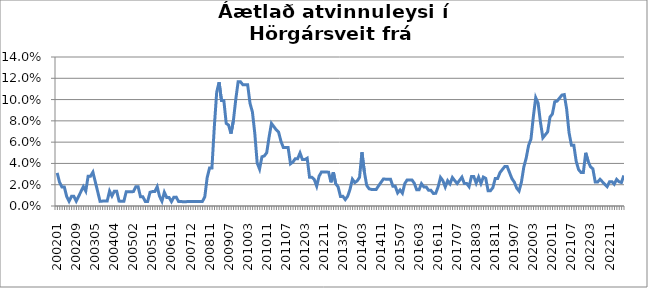
| Category | Series 0 |
|---|---|
| 200201 | 0.031 |
| 200202 | 0.022 |
| 200203 | 0.018 |
| 200204 | 0.018 |
| 200205 | 0.009 |
| 200206 | 0.004 |
| 200207 | 0.009 |
| 200208 | 0.009 |
| 200209 | 0.005 |
| 200210 | 0.009 |
| 200211 | 0.014 |
| 200212 | 0.018 |
| 200301 | 0.014 |
| 200302 | 0.028 |
| 200303 | 0.028 |
| 200304 | 0.032 |
| 200305 | 0.023 |
| 200306 | 0.014 |
| 200307 | 0.004 |
| 200311 | 0.005 |
| 200312 | 0.005 |
| 200401 | 0.005 |
| 200402 | 0.014 |
| 200403 | 0.009 |
| 200404 | 0.014 |
| 200405 | 0.014 |
| 200406 | 0.005 |
| 200409 | 0.004 |
| 200410 | 0.004 |
| 200411 | 0.013 |
| 200412 | 0.013 |
| 200501 | 0.013 |
| 200502 | 0.014 |
| 200503 | 0.018 |
| 200504 | 0.018 |
| 200505 | 0.009 |
| 200506 | 0.009 |
| 200507 | 0.004 |
| 200508 | 0.004 |
| 200510 | 0.013 |
| 200511 | 0.014 |
| 200512 | 0.014 |
| 200601 | 0.018 |
| 200602 | 0.009 |
| 200603 | 0.005 |
| 200606 | 0.013 |
| 200607 | 0.008 |
| 200608 | 0.008 |
| 200611 | 0.004 |
| 200612 | 0.008 |
| 200701 | 0.008 |
| 200702 | 0.004 |
| 200703 | 0.004 |
| 200704 | 0.004 |
| 200706 | 0.004 |
| 200711 | 0.004 |
| 200712 | 0.004 |
| 200801 | 0.004 |
| 200802 | 0.004 |
| 200803 | 0.004 |
| 200807 | 0.004 |
| 200808 | 0.004 |
| 200809 | 0.009 |
| 200810 | 0.027 |
| 200811 | 0.036 |
| 200812 | 0.036 |
| 200901 | 0.074 |
| 200902 | 0.107 |
| 200903 | 0.116 |
| 200904 | 0.099 |
| 200905 | 0.099 |
| 200906 | 0.078 |
| 200907 | 0.076 |
| 200908 | 0.068 |
| 200909 | 0.08 |
| 200910 | 0.1 |
| 200911 | 0.117 |
| 200912 | 0.117 |
| 201001 | 0.114 |
| 201002 | 0.114 |
| 201003 | 0.114 |
| 201004 | 0.096 |
| 201005 | 0.088 |
| 201006 | 0.068 |
| 201007 | 0.04 |
| 201008 | 0.035 |
| 201009 | 0.046 |
| 201010 | 0.047 |
| 201011 | 0.05 |
| 201012 | 0.065 |
| 201101 | 0.078 |
| 201102 | 0.075 |
| 201103 | 0.072 |
| 201104 | 0.069 |
| 201105 | 0.061 |
| 201106 | 0.055 |
| 201107 | 0.055 |
| 201108 | 0.055 |
| 201109 | 0.04 |
| 201110 | 0.041 |
| 201111 | 0.044 |
| 201112 | 0.044 |
| 201201 | 0.05 |
| 201202 | 0.044 |
| 201203 | 0.044 |
| 201204 | 0.045 |
| 201205 | 0.027 |
| 201206 | 0.027 |
| 201207 | 0.025 |
| 201208 | 0.019 |
| 201209 | 0.028 |
| 201210 | 0.032 |
| 201211 | 0.032 |
| 201212 | 0.032 |
| 201301 | 0.032 |
| 201302 | 0.022 |
| 201303 | 0.032 |
| 201304 | 0.021 |
| 201305 | 0.018 |
| 201306 | 0.009 |
| 201307 | 0.009 |
| 201308 | 0.006 |
| 201309 | 0.009 |
| 201310 | 0.016 |
| 201311 | 0.025 |
| 201312 | 0.022 |
| 201401 | 0.024 |
| 201402 | 0.027 |
| 201403 | 0.051 |
| 201404 | 0.032 |
| 201405 | 0.019 |
| 201406 | 0.016 |
| 201407 | 0.016 |
| 201408 | 0.016 |
| 201409 | 0.016 |
| 201410 | 0.019 |
| 201411 | 0.022 |
| 201412 | 0.025 |
| 201501 | 0.025 |
| 201502 | 0.025 |
| 201503 | 0.025 |
| 201504 | 0.018 |
| 201505 | 0.018 |
| 201506 | 0.012 |
| 201507 | 0.015 |
| 201508 | 0.012 |
| 201509 | 0.021 |
| 201510 | 0.025 |
| 201511 | 0.025 |
| 201512 | 0.025 |
| 201601 | 0.021 |
| 201602 | 0.015 |
| 201603 | 0.015 |
| 201604 | 0.021 |
| 201605 | 0.018 |
| 201606 | 0.018 |
| 201607 | 0.015 |
| 201608 | 0.015 |
| 201609 | 0.012 |
| 201610 | 0.012 |
| 201611 | 0.018 |
| 201612 | 0.027 |
| 201701 | 0.024 |
| 201702 | 0.018 |
| 201703 | 0.024 |
| 201704 | 0.021 |
| 201705 | 0.027 |
| 201706 | 0.024 |
| 201707 | 0.021 |
| 201708 | 0.024 |
| 201709 | 0.027 |
| 201710 | 0.021 |
| 201711 | 0.021 |
| 201712 | 0.018 |
| 201801 | 0.028 |
| 201802 | 0.028 |
| 201803 | 0.021 |
| 201804 | 0.027 |
| 201805 | 0.021 |
| 201806 | 0.027 |
| 201807 | 0.026 |
| 201808 | 0.014 |
| 201809 | 0.014 |
| 201810 | 0.017 |
| 201811 | 0.026 |
| 201812 | 0.026 |
| 201901 | 0.031 |
| 201902 | 0.034 |
| 201903 | 0.037 |
| 201904 | 0.037 |
| 201905 | 0.031 |
| 201906 | 0.026 |
| 201907 | 0.022 |
| 201908 | 0.017 |
| 201909 | 0.014 |
| 201910 | 0.023 |
| 201911 | 0.037 |
| 201912 | 0.045 |
| 202001 | 0.057 |
| 202002 | 0.063 |
| 202003 | 0.084 |
| 202004 | 0.102 |
| 202005 | 0.097 |
| 202006 | 0.079 |
| 202007 | 0.064 |
| 202008 | 0.067 |
| 202009 | 0.07 |
| 202010 | 0.084 |
| 202011 | 0.086 |
| 202012 | 0.098 |
| 202101 | 0.099 |
| 202102 | 0.101 |
| 202103 | 0.104 |
| 202104 | 0.105 |
| 202105 | 0.091 |
| 202106 | 0.069 |
| 202107 | 0.057 |
| 202108 | 0.057 |
| 202109 | 0.042 |
| 202110 | 0.034 |
| 202111 | 0.032 |
| 202112 | 0.032 |
| 202201 | 0.05 |
| 202202 | 0.042 |
| 202203 | 0.037 |
| 202204 | 0.035 |
| 202205 | 0.022 |
| 202206 | 0.022 |
| 202207 | 0.025 |
| 202208 | 0.023 |
| 202209 | 0.021 |
| 202210 | 0.018 |
| 202211 | 0.023 |
| 202212 | 0.023 |
| 202301 | 0.021 |
| 202302 | 0.025 |
| 202303 | 0.023 |
| 202304 | 0.022 |
| 202305 | 0.029 |